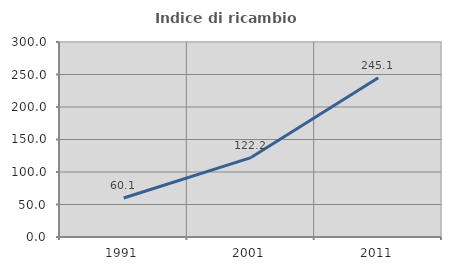
| Category | Indice di ricambio occupazionale  |
|---|---|
| 1991.0 | 60.083 |
| 2001.0 | 122.202 |
| 2011.0 | 245.146 |